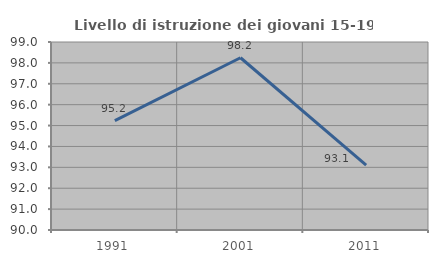
| Category | Livello di istruzione dei giovani 15-19 anni |
|---|---|
| 1991.0 | 95.238 |
| 2001.0 | 98.246 |
| 2011.0 | 93.103 |